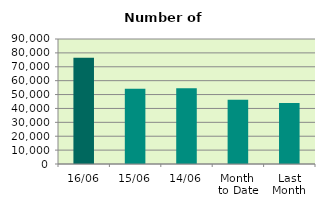
| Category | Series 0 |
|---|---|
| 16/06 | 76558 |
| 15/06 | 54160 |
| 14/06 | 54558 |
| Month 
to Date | 46225.833 |
| Last
Month | 44009.364 |